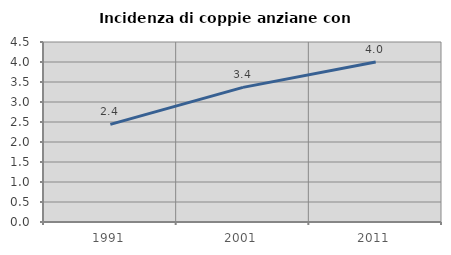
| Category | Incidenza di coppie anziane con figli |
|---|---|
| 1991.0 | 2.441 |
| 2001.0 | 3.366 |
| 2011.0 | 4.002 |